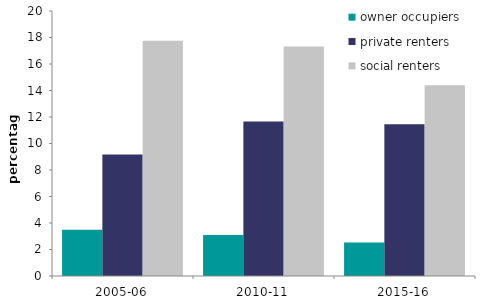
| Category | owner occupiers | private renters | social renters |
|---|---|---|---|
| 2005-06 | 3.494 | 9.174 | 17.75 |
| 2010-11 | 3.103 | 11.659 | 17.319 |
| 2015-16 | 2.525 | 11.457 | 14.394 |